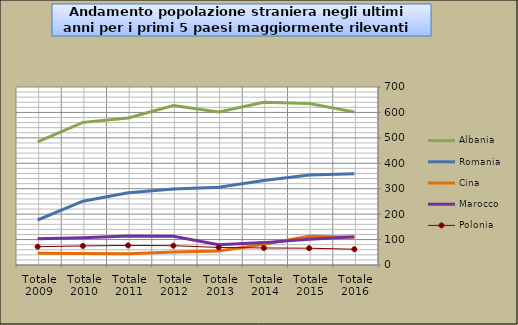
| Category | Series 1 | Albania | Romania | Cina | Marocco | Polonia |
|---|---|---|---|---|---|---|
| Totale 2016 |  | 602 | 359 | 109 | 111 | 62 |
| Totale 2015 |  | 635 | 354 | 113 | 101 | 66 |
| Totale 2014 |  | 640 | 332 | 82 | 88 | 67 |
| Totale 2013 |  | 602 | 306 | 55 | 80 | 69 |
| Totale 2012 |  | 627 | 299 | 51 | 113 | 76 |
| Totale 2011 |  | 578 | 284 | 44 | 114 | 77 |
| Totale 2010 |  | 561 | 251 | 45 | 107 | 75 |
| Totale 2009 |  | 484 | 177 | 46 | 103 | 72 |